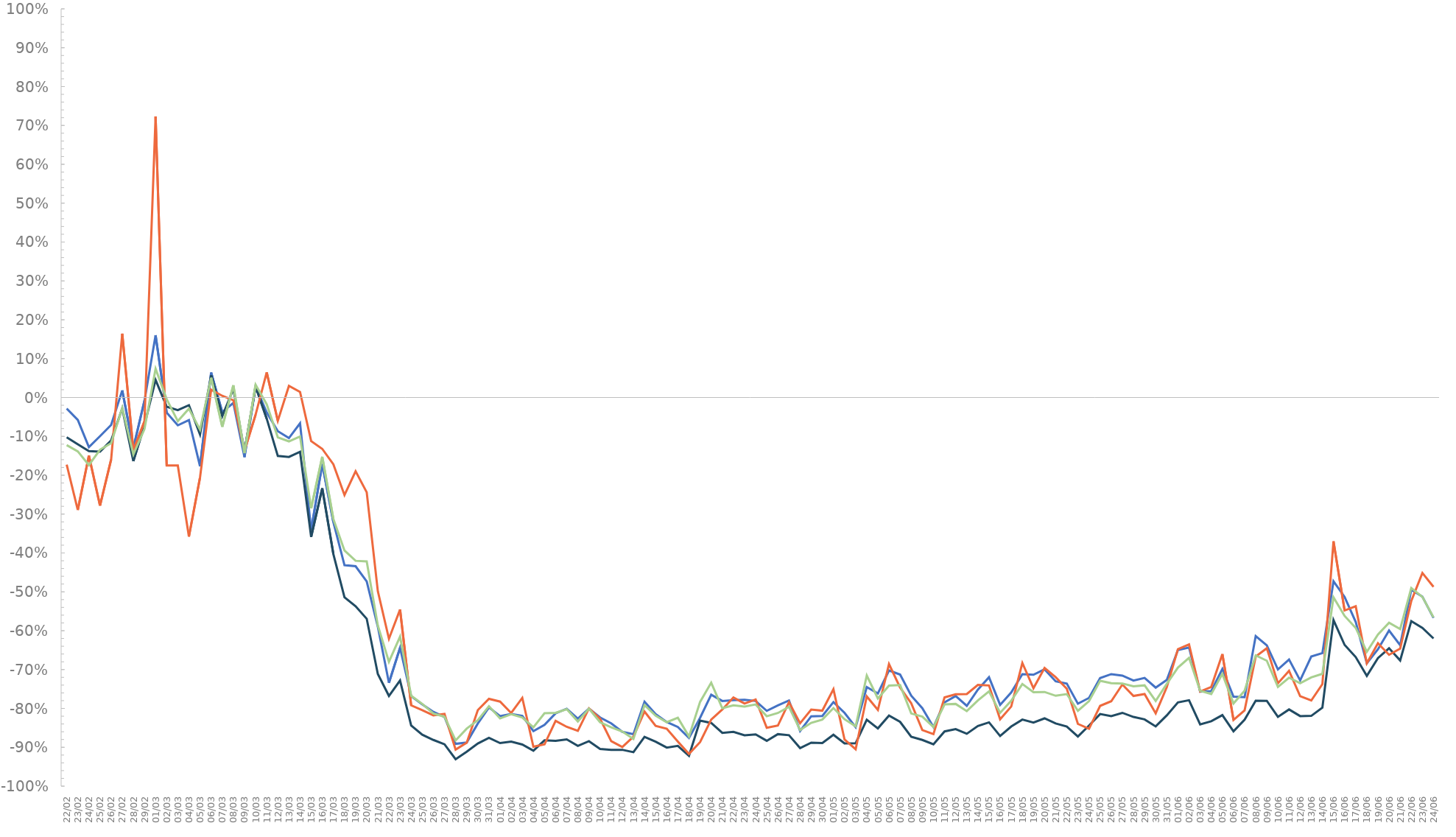
| Category | Series 0 | Series 1 | Series 2 | Series 3 |
|---|---|---|---|---|
| 2020-02-22 | -0.028 | -0.102 | -0.173 | -0.123 |
| 2020-02-23 | -0.058 | -0.121 | -0.289 | -0.139 |
| 2020-02-24 | -0.128 | -0.138 | -0.149 | -0.174 |
| 2020-02-25 | -0.099 | -0.139 | -0.278 | -0.134 |
| 2020-02-26 | -0.071 | -0.111 | -0.16 | -0.117 |
| 2020-02-27 | 0.018 | -0.028 | 0.164 | -0.027 |
| 2020-02-28 | -0.13 | -0.164 | -0.136 | -0.146 |
| 2020-02-29 | -0.008 | -0.071 | -0.061 | -0.081 |
| 2020-03-01 | 0.16 | 0.045 | 0.723 | 0.074 |
| 2020-03-02 | -0.039 | -0.024 | -0.175 | -0.004 |
| 2020-03-03 | -0.072 | -0.033 | -0.175 | -0.061 |
| 2020-03-04 | -0.058 | -0.02 | -0.358 | -0.029 |
| 2020-03-05 | -0.177 | -0.095 | -0.206 | -0.083 |
| 2020-03-06 | 0.064 | 0.057 | 0.02 | 0.051 |
| 2020-03-07 | -0.038 | -0.048 | 0.004 | -0.075 |
| 2020-03-08 | -0.014 | 0.022 | -0.007 | 0.031 |
| 2020-03-09 | -0.153 | -0.138 | -0.137 | -0.143 |
| 2020-03-10 | 0.029 | 0.028 | -0.044 | 0.033 |
| 2020-03-11 | -0.038 | -0.054 | 0.065 | -0.017 |
| 2020-03-12 | -0.087 | -0.15 | -0.06 | -0.103 |
| 2020-03-13 | -0.104 | -0.153 | 0.03 | -0.113 |
| 2020-03-14 | -0.066 | -0.14 | 0.014 | -0.1 |
| 2020-03-15 | -0.341 | -0.359 | -0.112 | -0.285 |
| 2020-03-16 | -0.171 | -0.234 | -0.132 | -0.152 |
| 2020-03-17 | -0.321 | -0.403 | -0.172 | -0.313 |
| 2020-03-18 | -0.431 | -0.514 | -0.251 | -0.394 |
| 2020-03-19 | -0.434 | -0.537 | -0.19 | -0.42 |
| 2020-03-20 | -0.473 | -0.569 | -0.244 | -0.422 |
| 2020-03-21 | -0.59 | -0.711 | -0.498 | -0.587 |
| 2020-03-22 | -0.734 | -0.768 | -0.621 | -0.68 |
| 2020-03-23 | -0.644 | -0.728 | -0.545 | -0.615 |
| 2020-03-24 | -0.769 | -0.844 | -0.792 | -0.767 |
| 2020-03-25 | -0.79 | -0.868 | -0.805 | -0.788 |
| 2020-03-26 | -0.809 | -0.881 | -0.818 | -0.813 |
| 2020-03-27 | -0.822 | -0.892 | -0.814 | -0.822 |
| 2020-03-28 | -0.891 | -0.931 | -0.906 | -0.882 |
| 2020-03-29 | -0.888 | -0.911 | -0.888 | -0.852 |
| 2020-03-30 | -0.839 | -0.89 | -0.804 | -0.83 |
| 2020-03-31 | -0.797 | -0.876 | -0.775 | -0.794 |
| 2020-04-01 | -0.82 | -0.889 | -0.782 | -0.826 |
| 2020-04-02 | -0.814 | -0.886 | -0.812 | -0.815 |
| 2020-04-03 | -0.819 | -0.893 | -0.773 | -0.823 |
| 2020-04-04 | -0.858 | -0.909 | -0.899 | -0.849 |
| 2020-04-05 | -0.842 | -0.882 | -0.892 | -0.812 |
| 2020-04-06 | -0.813 | -0.883 | -0.832 | -0.811 |
| 2020-04-07 | -0.801 | -0.88 | -0.847 | -0.802 |
| 2020-04-08 | -0.826 | -0.896 | -0.857 | -0.834 |
| 2020-04-09 | -0.8 | -0.884 | -0.8 | -0.801 |
| 2020-04-10 | -0.823 | -0.904 | -0.827 | -0.836 |
| 2020-04-11 | -0.838 | -0.906 | -0.884 | -0.848 |
| 2020-04-12 | -0.86 | -0.906 | -0.899 | -0.859 |
| 2020-04-13 | -0.866 | -0.913 | -0.873 | -0.879 |
| 2020-04-14 | -0.783 | -0.873 | -0.808 | -0.791 |
| 2020-04-15 | -0.815 | -0.886 | -0.845 | -0.819 |
| 2020-04-16 | -0.835 | -0.901 | -0.852 | -0.836 |
| 2020-04-17 | -0.848 | -0.896 | -0.885 | -0.824 |
| 2020-04-18 | -0.876 | -0.922 | -0.917 | -0.872 |
| 2020-04-19 | -0.824 | -0.831 | -0.887 | -0.783 |
| 2020-04-20 | -0.765 | -0.837 | -0.829 | -0.734 |
| 2020-04-21 | -0.781 | -0.863 | -0.803 | -0.8 |
| 2020-04-22 | -0.778 | -0.86 | -0.772 | -0.792 |
| 2020-04-23 | -0.778 | -0.869 | -0.788 | -0.795 |
| 2020-04-24 | -0.781 | -0.867 | -0.777 | -0.79 |
| 2020-04-25 | -0.806 | -0.883 | -0.85 | -0.82 |
| 2020-04-26 | -0.792 | -0.866 | -0.844 | -0.812 |
| 2020-04-27 | -0.78 | -0.869 | -0.784 | -0.796 |
| 2020-04-28 | -0.858 | -0.902 | -0.838 | -0.856 |
| 2020-04-29 | -0.82 | -0.888 | -0.803 | -0.837 |
| 2020-04-30 | -0.819 | -0.889 | -0.806 | -0.829 |
| 2020-05-01 | -0.784 | -0.868 | -0.75 | -0.799 |
| 2020-05-02 | -0.811 | -0.89 | -0.88 | -0.828 |
| 2020-05-03 | -0.848 | -0.889 | -0.905 | -0.846 |
| 2020-05-04 | -0.745 | -0.829 | -0.769 | -0.715 |
| 2020-05-05 | -0.762 | -0.851 | -0.804 | -0.774 |
| 2020-05-06 | -0.702 | -0.819 | -0.686 | -0.741 |
| 2020-05-07 | -0.713 | -0.835 | -0.746 | -0.74 |
| 2020-05-08 | -0.767 | -0.873 | -0.787 | -0.813 |
| 2020-05-09 | -0.799 | -0.881 | -0.856 | -0.821 |
| 2020-05-10 | -0.848 | -0.892 | -0.866 | -0.848 |
| 2020-05-11 | -0.784 | -0.859 | -0.772 | -0.79 |
| 2020-05-12 | -0.768 | -0.853 | -0.764 | -0.788 |
| 2020-05-13 | -0.793 | -0.865 | -0.763 | -0.807 |
| 2020-05-14 | -0.752 | -0.845 | -0.74 | -0.78 |
| 2020-05-15 | -0.72 | -0.836 | -0.741 | -0.756 |
| 2020-05-16 | -0.791 | -0.871 | -0.828 | -0.811 |
| 2020-05-17 | -0.759 | -0.847 | -0.795 | -0.78 |
| 2020-05-18 | -0.712 | -0.829 | -0.683 | -0.737 |
| 2020-05-19 | -0.713 | -0.836 | -0.748 | -0.758 |
| 2020-05-20 | -0.699 | -0.826 | -0.696 | -0.758 |
| 2020-05-21 | -0.73 | -0.839 | -0.72 | -0.767 |
| 2020-05-22 | -0.736 | -0.847 | -0.749 | -0.763 |
| 2020-05-23 | -0.788 | -0.872 | -0.84 | -0.806 |
| 2020-05-24 | -0.773 | -0.844 | -0.852 | -0.781 |
| 2020-05-25 | -0.722 | -0.814 | -0.793 | -0.729 |
| 2020-05-26 | -0.712 | -0.82 | -0.781 | -0.735 |
| 2020-05-27 | -0.716 | -0.811 | -0.738 | -0.736 |
| 2020-05-28 | -0.728 | -0.822 | -0.768 | -0.743 |
| 2020-05-29 | -0.722 | -0.828 | -0.763 | -0.741 |
| 2020-05-30 | -0.746 | -0.846 | -0.813 | -0.781 |
| 2020-05-31 | -0.727 | -0.818 | -0.745 | -0.737 |
| 2020-06-01 | -0.65 | -0.784 | -0.648 | -0.695 |
| 2020-06-02 | -0.643 | -0.779 | -0.635 | -0.67 |
| 2020-06-03 | -0.757 | -0.841 | -0.756 | -0.754 |
| 2020-06-04 | -0.755 | -0.833 | -0.745 | -0.763 |
| 2020-06-05 | -0.698 | -0.817 | -0.66 | -0.711 |
| 2020-06-06 | -0.77 | -0.859 | -0.829 | -0.787 |
| 2020-06-07 | -0.771 | -0.829 | -0.805 | -0.754 |
| 2020-06-08 | -0.614 | -0.78 | -0.667 | -0.663 |
| 2020-06-09 | -0.638 | -0.781 | -0.645 | -0.677 |
| 2020-06-10 | -0.7 | -0.822 | -0.735 | -0.745 |
| 2020-06-11 | -0.674 | -0.803 | -0.703 | -0.721 |
| 2020-06-12 | -0.728 | -0.82 | -0.768 | -0.735 |
| 2020-06-13 | -0.666 | -0.819 | -0.78 | -0.72 |
| 2020-06-14 | -0.658 | -0.798 | -0.737 | -0.711 |
| 2020-06-15 | -0.473 | -0.573 | -0.37 | -0.514 |
| 2020-06-16 | -0.513 | -0.637 | -0.548 | -0.562 |
| 2020-06-17 | -0.577 | -0.668 | -0.537 | -0.593 |
| 2020-06-18 | -0.684 | -0.716 | -0.684 | -0.654 |
| 2020-06-19 | -0.648 | -0.67 | -0.632 | -0.61 |
| 2020-06-20 | -0.6 | -0.645 | -0.662 | -0.579 |
| 2020-06-21 | -0.637 | -0.677 | -0.646 | -0.596 |
| 2020-06-22 | -0.495 | -0.575 | -0.523 | -0.49 |
| 2020-06-23 | -0.512 | -0.593 | -0.451 | -0.513 |
| 2020-06-24 | -0.567 | -0.62 | -0.487 | -0.566 |